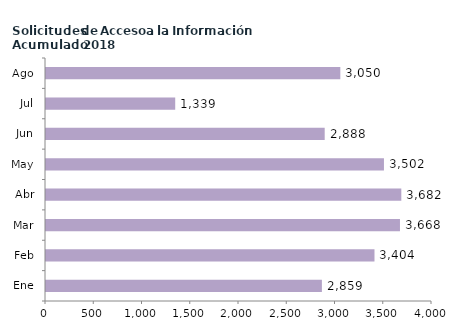
| Category | Series 0 |
|---|---|
| Ene | 2859 |
| Feb | 3404 |
| Mar | 3668 |
| Abr | 3682 |
| May | 3502 |
| Jun | 2888 |
| Jul | 1339 |
| Ago | 3050 |